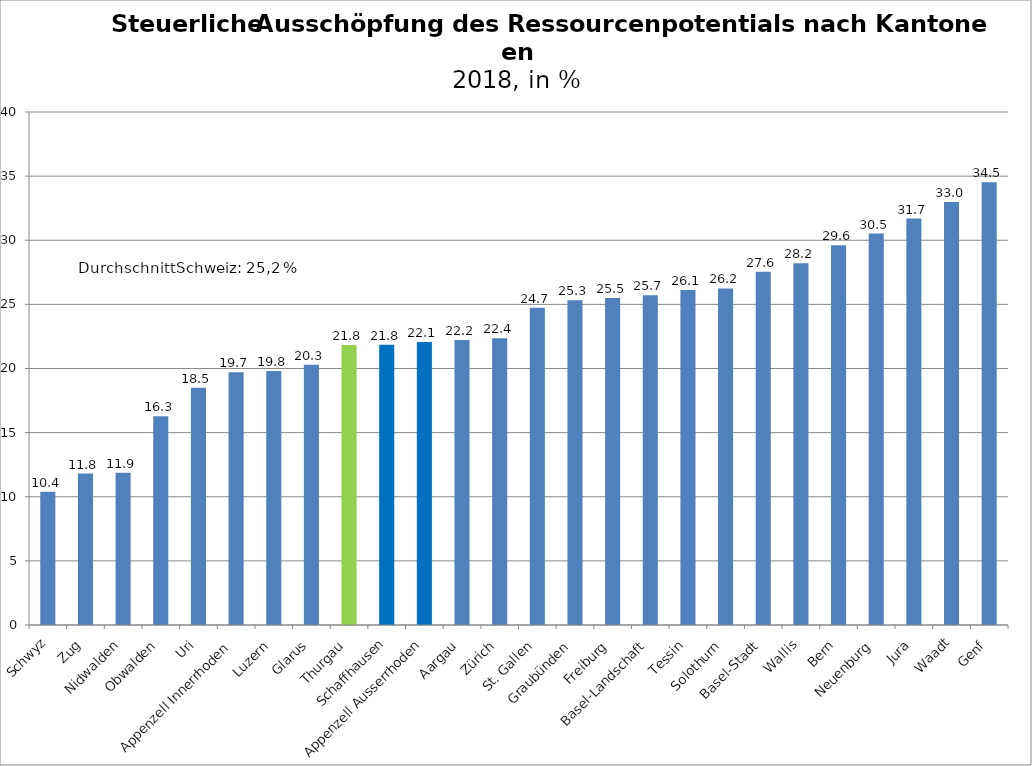
| Category | Series 0 |
|---|---|
| Schwyz | 10.391 |
| Zug | 11.81 |
| Nidwalden | 11.872 |
| Obwalden | 16.269 |
| Uri | 18.507 |
| Appenzell Innerrhoden | 19.708 |
| Luzern | 19.81 |
| Glarus | 20.288 |
| Thurgau | 21.829 |
| Schaffhausen | 21.845 |
| Appenzell Ausserrhoden | 22.07 |
| Aargau | 22.217 |
| Zürich | 22.36 |
| St. Gallen | 24.733 |
| Graubünden | 25.316 |
| Freiburg | 25.501 |
| Basel-Landschaft | 25.718 |
| Tessin | 26.125 |
| Solothurn | 26.242 |
| Basel-Stadt | 27.552 |
| Wallis | 28.197 |
| Bern | 29.612 |
| Neuenburg | 30.521 |
| Jura | 31.687 |
| Waadt | 32.988 |
| Genf | 34.519 |